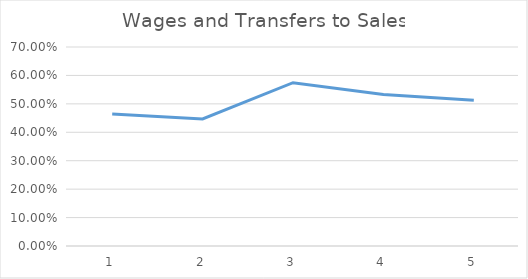
| Category | Series 0 |
|---|---|
| 0 | 0.465 |
| 1 | 0.447 |
| 2 | 0.575 |
| 3 | 0.533 |
| 4 | 0.513 |